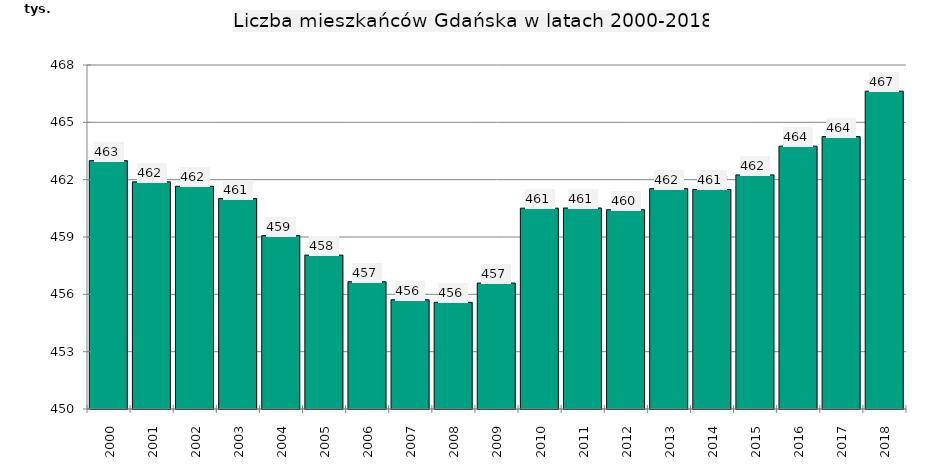
| Category | Liczba ludności ogółem* |
|---|---|
| 2000.0 | 462995 |
| 2001.0 | 461885 |
| 2002.0 | 461653 |
| 2003.0 | 461011 |
| 2004.0 | 459072 |
| 2005.0 | 458053 |
| 2006.0 | 456658 |
| 2007.0 | 455717 |
| 2008.0 | 455581 |
| 2009.0 | 456591 |
| 2010.0 | 460509 |
| 2011.0 | 460517 |
| 2012.0 | 460427 |
| 2013.0 | 461531 |
| 2014.0 | 461489 |
| 2015.0 | 462249 |
| 2016.0 | 463754 |
| 2017.0 | 464254 |
| 2018.0 | 466631 |